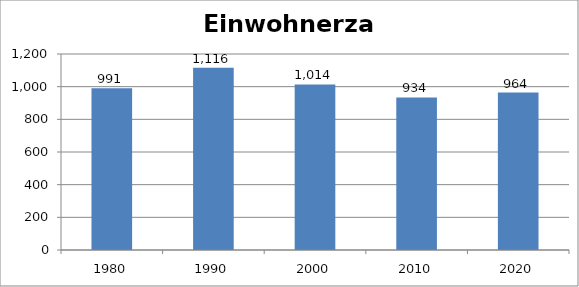
| Category | Einwohnerzahl |
|---|---|
| 1980.0 | 991 |
| 1990.0 | 1116 |
| 2000.0 | 1014 |
| 2010.0 | 934 |
| 2020.0 | 964 |